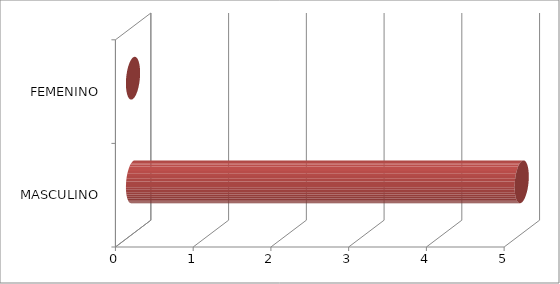
| Category | Series 0 |
|---|---|
| MASCULINO | 5 |
| FEMENINO | 0 |